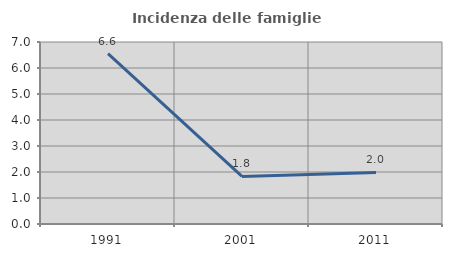
| Category | Incidenza delle famiglie numerose |
|---|---|
| 1991.0 | 6.553 |
| 2001.0 | 1.828 |
| 2011.0 | 1.983 |